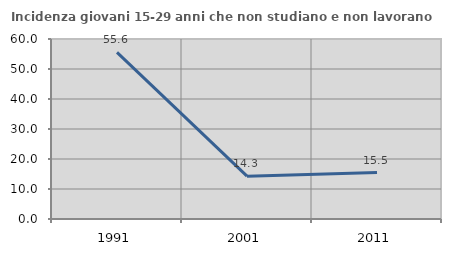
| Category | Incidenza giovani 15-29 anni che non studiano e non lavorano  |
|---|---|
| 1991.0 | 55.556 |
| 2001.0 | 14.286 |
| 2011.0 | 15.468 |